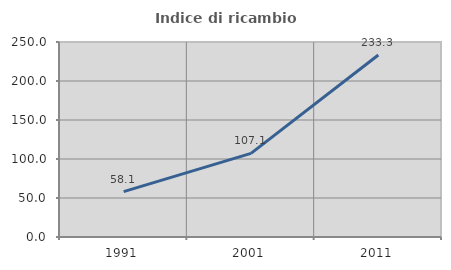
| Category | Indice di ricambio occupazionale  |
|---|---|
| 1991.0 | 58.115 |
| 2001.0 | 107.143 |
| 2011.0 | 233.333 |